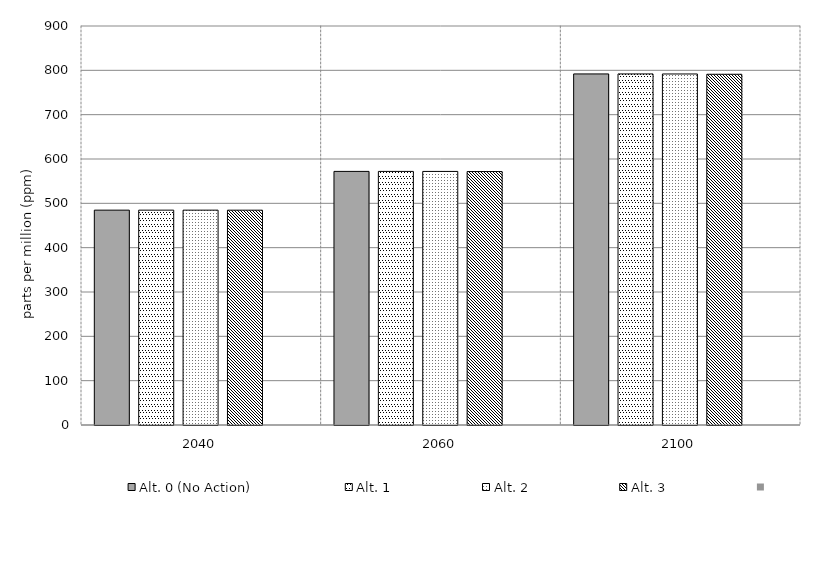
| Category | Alt. 0 (No Action) | Alt. 1 | Alt. 2 | Alt. 3 | Series 4 | Alt 5 | Alt 6 | Alt 7 | Alt 8 | Alt 10 |
|---|---|---|---|---|---|---|---|---|---|---|
| 2040.0 | 484.639 | 484.628 | 484.62 | 484.544 |  |  |  |  |  |  |
| 2060.0 | 572.027 | 572.009 | 571.977 | 571.679 |  |  |  |  |  |  |
| 2100.0 | 791.896 | 791.873 | 791.792 | 791.097 |  |  |  |  |  |  |